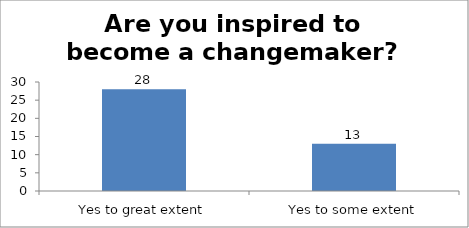
| Category | Are you inspired to become a changemaker?   |
|---|---|
| Yes to great extent | 28 |
| Yes to some extent | 13 |